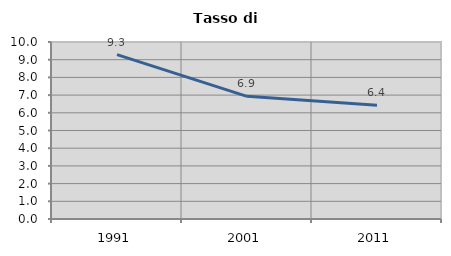
| Category | Tasso di disoccupazione   |
|---|---|
| 1991.0 | 9.289 |
| 2001.0 | 6.931 |
| 2011.0 | 6.429 |